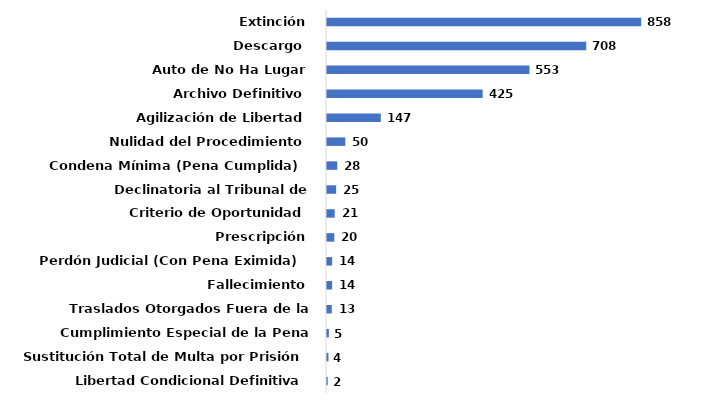
| Category | Series 0 |
|---|---|
| Libertad Condicional Definitiva | 0.001 |
| Sustitución Total de Multa por Prisión | 0.001 |
| Cumplimiento Especial de la Pena Definitivo | 0.002 |
| Traslados Otorgados Fuera de la Jurisdicción | 0.005 |
| Fallecimiento | 0.005 |
| Perdón Judicial (Con Pena Eximida)  | 0.005 |
| Prescripción | 0.007 |
| Criterio de Oportunidad | 0.007 |
| Declinatoria al Tribunal de Adolescentes | 0.009 |
| Condena Mínima (Pena Cumplida)  | 0.01 |
| Nulidad del Procedimiento | 0.017 |
| Agilización de Libertad | 0.051 |
| Archivo Definitivo | 0.147 |
| Auto de No Ha Lugar | 0.192 |
| Descargo  | 0.245 |
| Extinción | 0.297 |